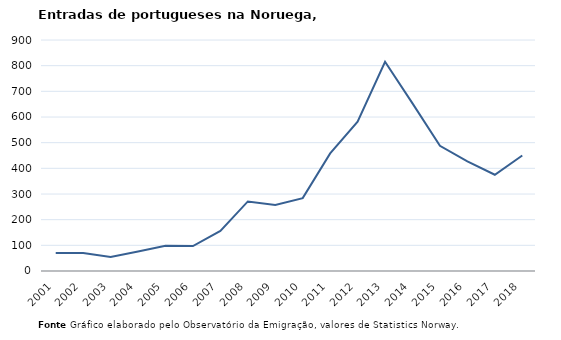
| Category | Entradas |
|---|---|
| 2001.0 | 70 |
| 2002.0 | 70 |
| 2003.0 | 55 |
| 2004.0 | 76 |
| 2005.0 | 98 |
| 2006.0 | 97 |
| 2007.0 | 156 |
| 2008.0 | 271 |
| 2009.0 | 257 |
| 2010.0 | 284 |
| 2011.0 | 458 |
| 2012.0 | 582 |
| 2013.0 | 815 |
| 2014.0 | 653 |
| 2015.0 | 488 |
| 2016.0 | 427 |
| 2017.0 | 375 |
| 2018.0 | 450 |